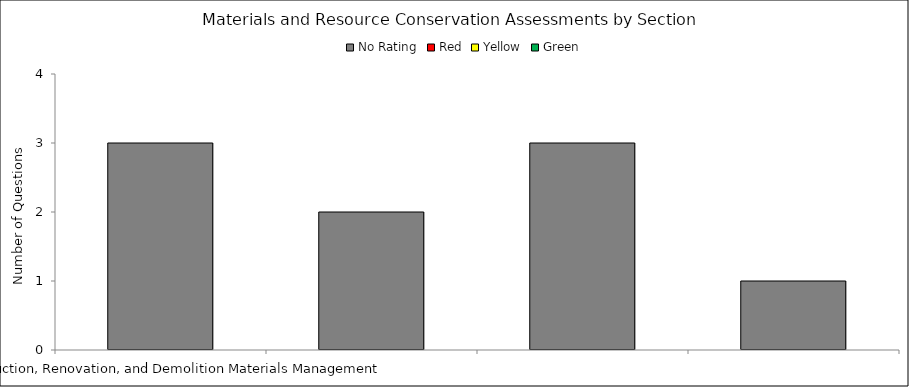
| Category | No Rating | Red | Yellow | Green |
|---|---|---|---|---|
| B.1 Construction, Renovation, and Demolition Materials Management | 3 | 0 | 0 | 0 |
| B.2 Building Reuse | 2 | 0 | 0 | 0 |
| B.3 Material Reuse | 3 | 0 | 0 | 0 |
| B.4 Material Selection | 1 | 0 | 0 | 0 |